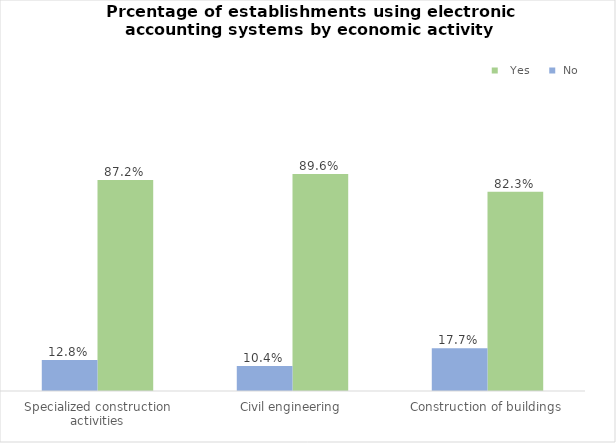
| Category |   Yes |  No |
|---|---|---|
| Construction of buildings | 0.823 | 0.177 |
| Civil engineering | 0.896 | 0.104 |
| Specialized construction activities | 0.872 | 0.128 |